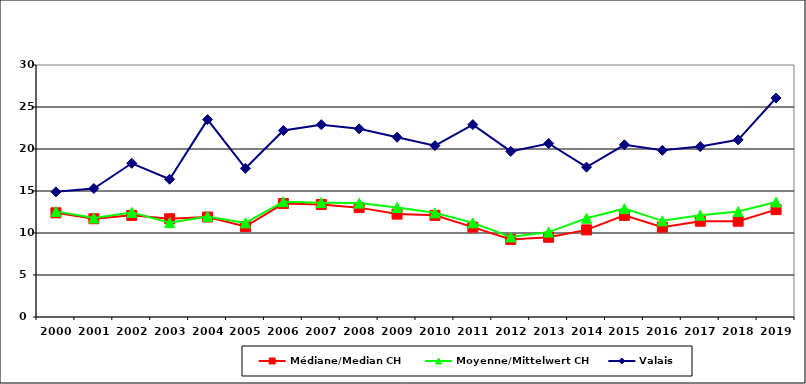
| Category | Médiane/Median CH | Moyenne/Mittelwert CH | Valais |
|---|---|---|---|
| 2000.0 | 12.4 | 12.575 | 14.9 |
| 2001.0 | 11.7 | 11.788 | 15.3 |
| 2002.0 | 12.1 | 12.452 | 18.3 |
| 2003.0 | 11.7 | 11.236 | 16.4 |
| 2004.0 | 11.9 | 11.971 | 23.5 |
| 2005.0 | 10.768 | 11.206 | 17.7 |
| 2006.0 | 13.5 | 13.724 | 22.2 |
| 2007.0 | 13.4 | 13.616 | 22.9 |
| 2008.0 | 13.02 | 13.561 | 22.4 |
| 2009.0 | 12.25 | 13.048 | 21.4 |
| 2010.0 | 12.1 | 12.4 | 20.4 |
| 2011.0 | 10.7 | 11.209 | 22.9 |
| 2012.0 | 9.23 | 9.534 | 19.71 |
| 2013.0 | 9.49 | 10.106 | 20.66 |
| 2014.0 | 10.37 | 11.762 | 17.84 |
| 2015.0 | 12.1 | 12.906 | 20.5 |
| 2016.0 | 10.7 | 11.448 | 19.84 |
| 2017.0 | 11.4 | 12.116 | 20.29 |
| 2018.0 | 11.4 | 12.549 | 21.09 |
| 2019.0 | 12.784 | 13.693 | 26.07 |